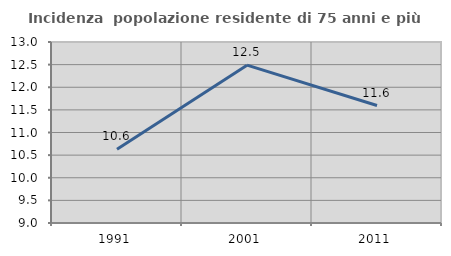
| Category | Incidenza  popolazione residente di 75 anni e più |
|---|---|
| 1991.0 | 10.631 |
| 2001.0 | 12.488 |
| 2011.0 | 11.596 |